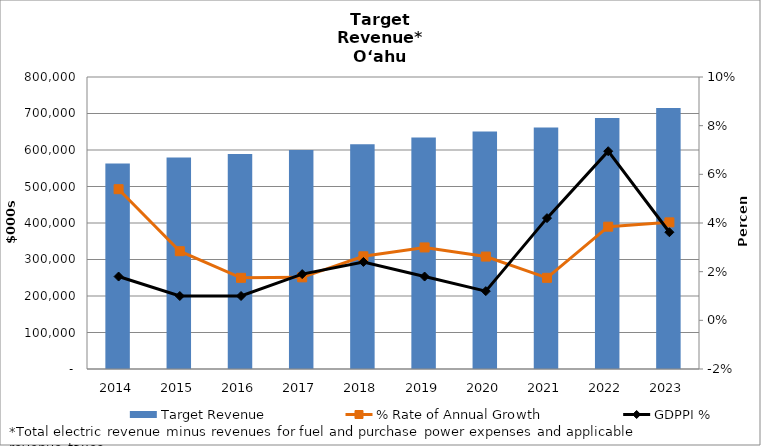
| Category | Target Revenue |
|---|---|
| 2014.0 | 563164.585 |
| 2015.0 | 579162.593 |
| 2016.0 | 589283.02 |
| 2017.0 | 599695.753 |
| 2018.0 | 615475.268 |
| 2019.0 | 633917.015 |
| 2020.0 | 650526.953 |
| 2021.0 | 661891.535 |
| 2022.0 | 687361.207 |
| 2023.0 | 715039.186 |